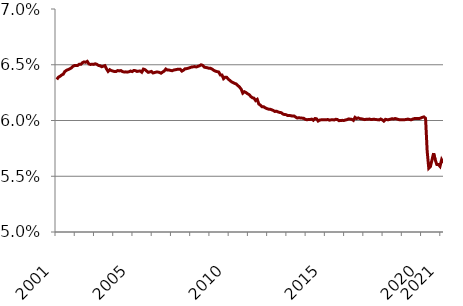
| Category | Share of Population |
|---|---|
| 2001.0 | 0.064 |
| 2001.0 | 0.064 |
| 2001.0 | 0.064 |
| 2001.0 | 0.064 |
| 2001.0 | 0.064 |
| 2001.0 | 0.064 |
| 2001.0 | 0.064 |
| 2001.0 | 0.065 |
| 2001.0 | 0.065 |
| 2001.0 | 0.065 |
| 2001.0 | 0.065 |
| 2001.0 | 0.065 |
| nan | 0.065 |
| nan | 0.065 |
| nan | 0.065 |
| nan | 0.065 |
| nan | 0.065 |
| nan | 0.065 |
| nan | 0.065 |
| nan | 0.065 |
| nan | 0.065 |
| nan | 0.065 |
| nan | 0.065 |
| nan | 0.065 |
| nan | 0.065 |
| nan | 0.065 |
| nan | 0.065 |
| nan | 0.065 |
| nan | 0.065 |
| nan | 0.065 |
| nan | 0.065 |
| nan | 0.065 |
| nan | 0.064 |
| nan | 0.065 |
| nan | 0.064 |
| nan | 0.064 |
| nan | 0.064 |
| nan | 0.064 |
| nan | 0.064 |
| nan | 0.064 |
| nan | 0.064 |
| nan | 0.064 |
| nan | 0.064 |
| nan | 0.064 |
| nan | 0.064 |
| nan | 0.064 |
| nan | 0.064 |
| nan | 0.064 |
| 2005.0 | 0.064 |
| 2005.0 | 0.064 |
| 2005.0 | 0.064 |
| 2005.0 | 0.064 |
| 2005.0 | 0.064 |
| 2005.0 | 0.064 |
| 2005.0 | 0.065 |
| 2005.0 | 0.065 |
| 2005.0 | 0.064 |
| 2005.0 | 0.064 |
| 2005.0 | 0.064 |
| 2005.0 | 0.064 |
| nan | 0.064 |
| nan | 0.064 |
| nan | 0.064 |
| nan | 0.064 |
| nan | 0.064 |
| nan | 0.064 |
| nan | 0.064 |
| nan | 0.064 |
| nan | 0.065 |
| nan | 0.065 |
| nan | 0.065 |
| nan | 0.064 |
| nan | 0.064 |
| nan | 0.065 |
| nan | 0.065 |
| nan | 0.065 |
| nan | 0.065 |
| nan | 0.065 |
| nan | 0.064 |
| nan | 0.065 |
| nan | 0.065 |
| nan | 0.065 |
| nan | 0.065 |
| nan | 0.065 |
| nan | 0.065 |
| nan | 0.065 |
| nan | 0.065 |
| nan | 0.065 |
| nan | 0.065 |
| nan | 0.065 |
| nan | 0.065 |
| nan | 0.065 |
| nan | 0.065 |
| nan | 0.065 |
| nan | 0.065 |
| nan | 0.065 |
| nan | 0.065 |
| nan | 0.065 |
| nan | 0.064 |
| nan | 0.064 |
| nan | 0.064 |
| nan | 0.064 |
| nan | 0.064 |
| nan | 0.064 |
| nan | 0.064 |
| nan | 0.064 |
| nan | 0.064 |
| nan | 0.064 |
| 2010.0 | 0.064 |
| 2010.0 | 0.063 |
| 2010.0 | 0.063 |
| 2010.0 | 0.063 |
| 2010.0 | 0.063 |
| 2010.0 | 0.063 |
| 2010.0 | 0.063 |
| 2010.0 | 0.063 |
| 2010.0 | 0.062 |
| 2010.0 | 0.063 |
| 2010.0 | 0.063 |
| 2010.0 | 0.062 |
| nan | 0.062 |
| nan | 0.062 |
| nan | 0.062 |
| nan | 0.062 |
| nan | 0.062 |
| nan | 0.062 |
| nan | 0.061 |
| nan | 0.061 |
| nan | 0.061 |
| nan | 0.061 |
| nan | 0.061 |
| nan | 0.061 |
| nan | 0.061 |
| nan | 0.061 |
| nan | 0.061 |
| nan | 0.061 |
| nan | 0.061 |
| nan | 0.061 |
| nan | 0.061 |
| nan | 0.061 |
| nan | 0.061 |
| nan | 0.061 |
| nan | 0.061 |
| nan | 0.061 |
| nan | 0.06 |
| nan | 0.06 |
| nan | 0.06 |
| nan | 0.06 |
| nan | 0.06 |
| nan | 0.06 |
| nan | 0.06 |
| nan | 0.06 |
| nan | 0.06 |
| nan | 0.06 |
| nan | 0.06 |
| nan | 0.06 |
| nan | 0.06 |
| nan | 0.06 |
| nan | 0.06 |
| nan | 0.06 |
| nan | 0.06 |
| nan | 0.06 |
| nan | 0.06 |
| nan | 0.06 |
| nan | 0.06 |
| nan | 0.06 |
| nan | 0.06 |
| nan | 0.06 |
| 2015.0 | 0.06 |
| 2015.0 | 0.06 |
| 2015.0 | 0.06 |
| 2015.0 | 0.06 |
| 2015.0 | 0.06 |
| 2015.0 | 0.06 |
| 2015.0 | 0.06 |
| 2015.0 | 0.06 |
| 2015.0 | 0.06 |
| 2015.0 | 0.06 |
| 2015.0 | 0.06 |
| 2015.0 | 0.06 |
| nan | 0.06 |
| nan | 0.06 |
| nan | 0.06 |
| nan | 0.06 |
| nan | 0.06 |
| nan | 0.06 |
| nan | 0.06 |
| nan | 0.06 |
| nan | 0.06 |
| nan | 0.06 |
| nan | 0.06 |
| nan | 0.06 |
| nan | 0.06 |
| nan | 0.06 |
| nan | 0.06 |
| nan | 0.06 |
| nan | 0.06 |
| nan | 0.06 |
| nan | 0.06 |
| nan | 0.06 |
| nan | 0.06 |
| nan | 0.06 |
| nan | 0.06 |
| nan | 0.06 |
| nan | 0.06 |
| nan | 0.06 |
| nan | 0.06 |
| nan | 0.06 |
| nan | 0.06 |
| nan | 0.06 |
| nan | 0.06 |
| nan | 0.06 |
| nan | 0.06 |
| nan | 0.06 |
| nan | 0.06 |
| nan | 0.06 |
| nan | 0.06 |
| nan | 0.06 |
| nan | 0.06 |
| nan | 0.06 |
| nan | 0.06 |
| nan | 0.06 |
| nan | 0.06 |
| nan | 0.06 |
| nan | 0.06 |
| nan | 0.06 |
| nan | 0.06 |
| nan | 0.06 |
| 2020.0 | 0.06 |
| 2020.0 | 0.06 |
| 2020.0 | 0.06 |
| 2020.0 | 0.057 |
| 2020.0 | 0.056 |
| 2020.0 | 0.056 |
| 2020.0 | 0.056 |
| 2020.0 | 0.057 |
| 2020.0 | 0.056 |
| 2020.0 | 0.056 |
| 2020.0 | 0.056 |
| 2020.0 | 0.056 |
| 2021.0 | 0.056 |
| 2021.0 | 0.056 |